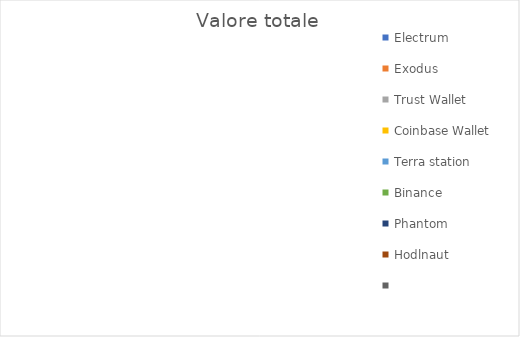
| Category | Valore totale |
|---|---|
| Electrum | 0 |
| Exodus | 0 |
| Trust Wallet | 0 |
| Coinbase Wallet | 0 |
| Terra station | 0 |
| Binance | 0 |
| Phantom | 0 |
| Hodlnaut | 0 |